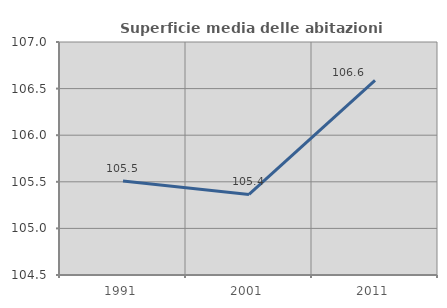
| Category | Superficie media delle abitazioni occupate |
|---|---|
| 1991.0 | 105.508 |
| 2001.0 | 105.364 |
| 2011.0 | 106.587 |